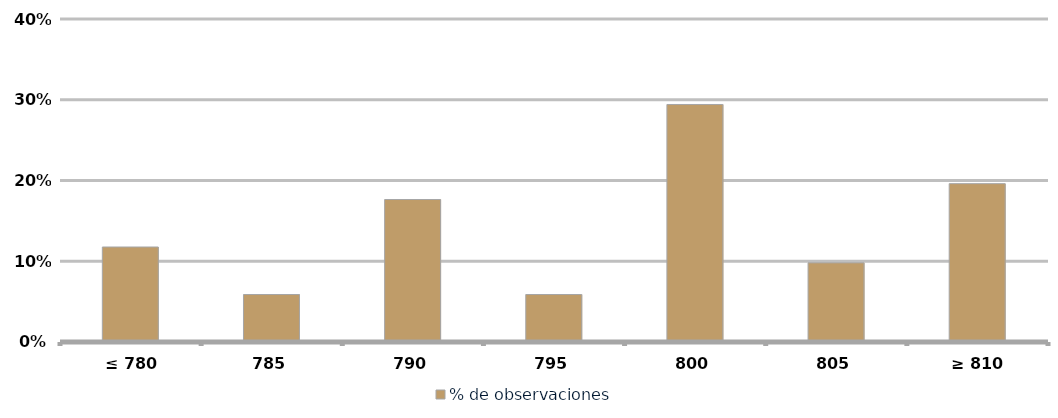
| Category | % de observaciones  |
|---|---|
|  ≤ 780  | 0.118 |
|  785  | 0.059 |
|  790  | 0.176 |
|  795  | 0.059 |
|  800  | 0.294 |
| 805 | 0.098 |
|  ≥ 810  | 0.196 |